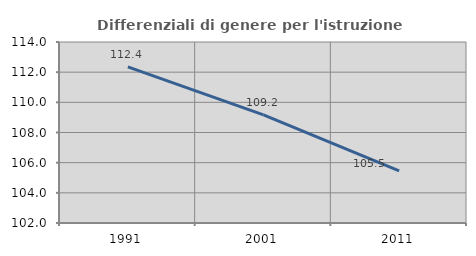
| Category | Differenziali di genere per l'istruzione superiore |
|---|---|
| 1991.0 | 112.352 |
| 2001.0 | 109.168 |
| 2011.0 | 105.462 |